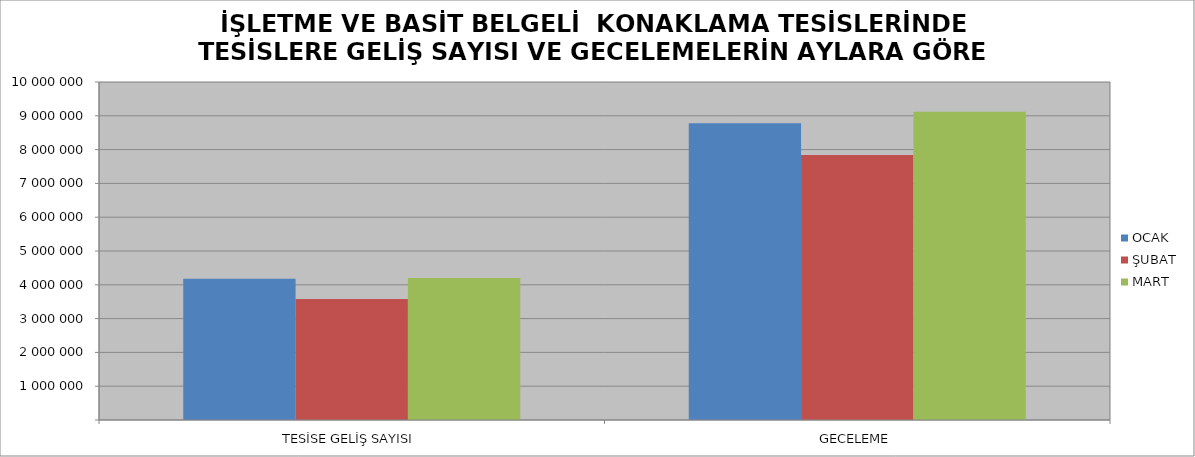
| Category | OCAK | ŞUBAT | MART |
|---|---|---|---|
| TESİSE GELİŞ SAYISI | 4176369 | 3577989 | 4200030 |
| GECELEME | 8783046 | 7837722 | 9122802 |